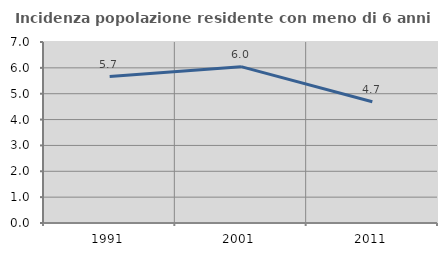
| Category | Incidenza popolazione residente con meno di 6 anni |
|---|---|
| 1991.0 | 5.665 |
| 2001.0 | 6.047 |
| 2011.0 | 4.688 |